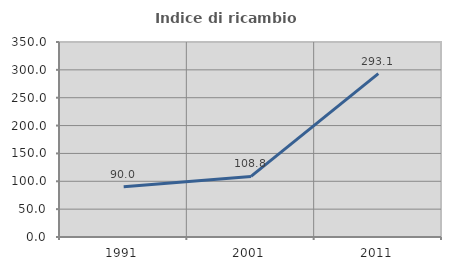
| Category | Indice di ricambio occupazionale  |
|---|---|
| 1991.0 | 90 |
| 2001.0 | 108.772 |
| 2011.0 | 293.103 |